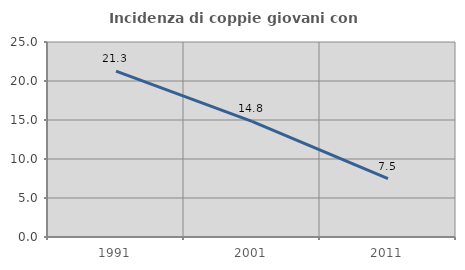
| Category | Incidenza di coppie giovani con figli |
|---|---|
| 1991.0 | 21.273 |
| 2001.0 | 14.823 |
| 2011.0 | 7.477 |